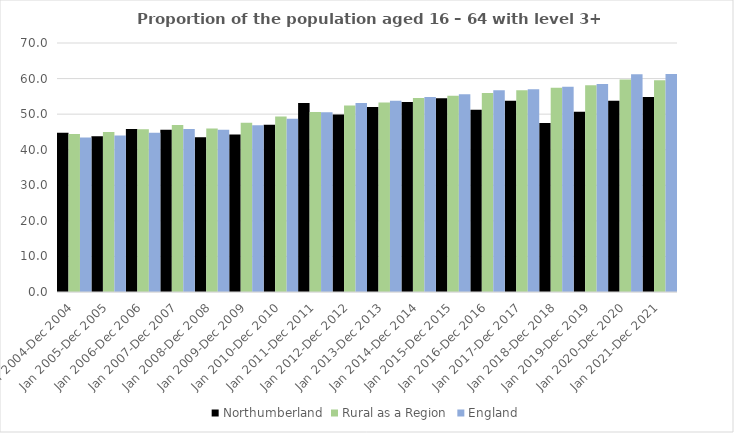
| Category | Northumberland | Rural as a Region | England |
|---|---|---|---|
| Jan 2004-Dec 2004 | 44.8 | 44.405 | 43.4 |
| Jan 2005-Dec 2005 | 43.8 | 44.973 | 44 |
| Jan 2006-Dec 2006 | 45.8 | 45.774 | 44.8 |
| Jan 2007-Dec 2007 | 45.6 | 46.968 | 45.8 |
| Jan 2008-Dec 2008 | 43.5 | 45.964 | 45.6 |
| Jan 2009-Dec 2009 | 44.3 | 47.59 | 46.9 |
| Jan 2010-Dec 2010 | 47 | 49.362 | 48.7 |
| Jan 2011-Dec 2011 | 53.1 | 50.602 | 50.5 |
| Jan 2012-Dec 2012 | 49.9 | 52.439 | 53.1 |
| Jan 2013-Dec 2013 | 52 | 53.276 | 53.8 |
| Jan 2014-Dec 2014 | 53.4 | 54.57 | 54.8 |
| Jan 2015-Dec 2015 | 54.5 | 55.16 | 55.6 |
| Jan 2016-Dec 2016 | 51.2 | 55.941 | 56.7 |
| Jan 2017-Dec 2017 | 53.8 | 56.689 | 57 |
| Jan 2018-Dec 2018 | 47.5 | 57.389 | 57.7 |
| Jan 2019-Dec 2019 | 50.7 | 58.147 | 58.5 |
| Jan 2020-Dec 2020 | 53.8 | 59.771 | 61.2 |
| Jan 2021-Dec 2021 | 54.8 | 59.54 | 61.3 |